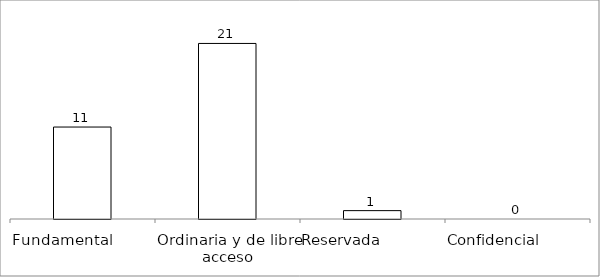
| Category | Series 0 |
|---|---|
| Fundamental         | 11 |
| Ordinaria y de libre acceso | 21 |
| Reservada               | 1 |
| Confidencial             | 0 |